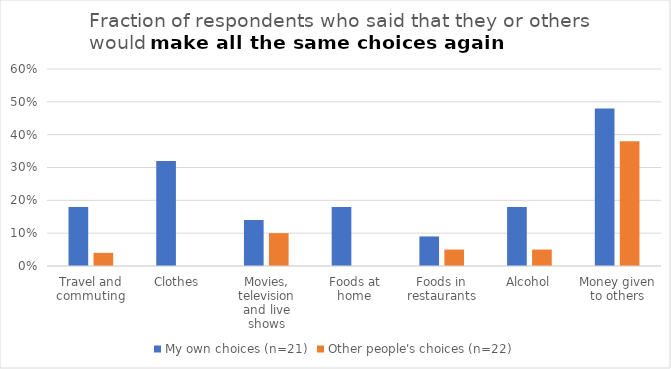
| Category | My own choices (n=21) | Other people's choices (n=22) |
|---|---|---|
| Travel and commuting | 0.18 | 0.04 |
| Clothes | 0.32 | 0 |
| Movies, television and live shows | 0.14 | 0.1 |
| Foods at home | 0.18 | 0 |
| Foods in restaurants | 0.09 | 0.05 |
| Alcohol | 0.18 | 0.05 |
| Money given to others | 0.48 | 0.38 |